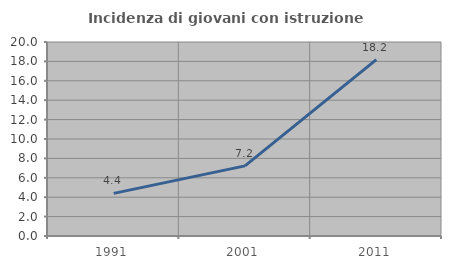
| Category | Incidenza di giovani con istruzione universitaria |
|---|---|
| 1991.0 | 4.396 |
| 2001.0 | 7.229 |
| 2011.0 | 18.182 |